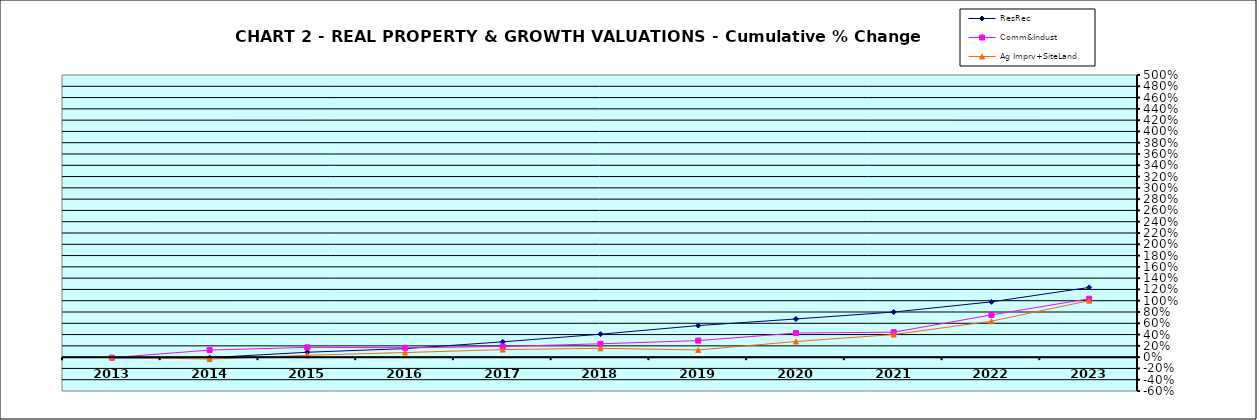
| Category | ResRec | Comm&Indust | Ag Imprv+SiteLand |
|---|---|---|---|
| 2013.0 | -0.013 | -0.01 | 0 |
| 2014.0 | -0.009 | 0.126 | -0.035 |
| 2015.0 | 0.087 | 0.173 | 0.033 |
| 2016.0 | 0.151 | 0.166 | 0.082 |
| 2017.0 | 0.271 | 0.189 | 0.134 |
| 2018.0 | 0.407 | 0.236 | 0.156 |
| 2019.0 | 0.56 | 0.293 | 0.127 |
| 2020.0 | 0.676 | 0.427 | 0.277 |
| 2021.0 | 0.799 | 0.442 | 0.401 |
| 2022.0 | 0.98 | 0.748 | 0.637 |
| 2023.0 | 1.235 | 1.035 | 1.002 |